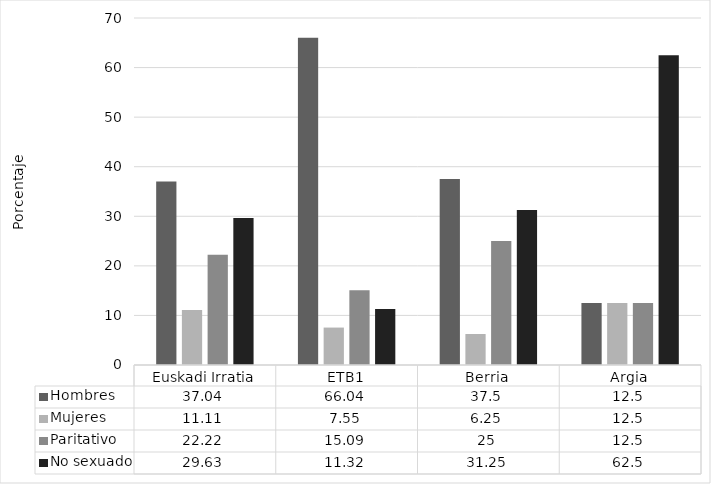
| Category | Hombres | Mujeres | Paritativo | No sexuado |
|---|---|---|---|---|
| Euskadi Irratia | 37.04 | 11.11 | 22.22 | 29.63 |
| ETB1 | 66.04 | 7.55 | 15.09 | 11.32 |
| Berria | 37.5 | 6.25 | 25 | 31.25 |
| Argia | 12.5 | 12.5 | 12.5 | 62.5 |